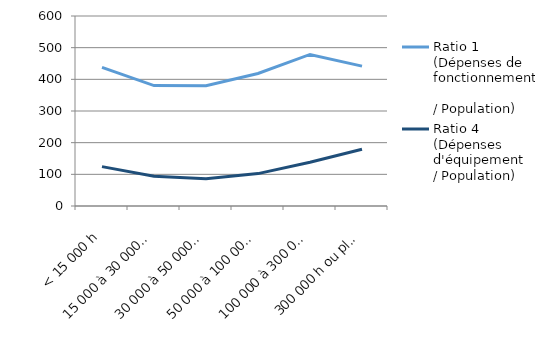
| Category | Ratio 1 
(Dépenses de fonctionnement 
/ Population) | Ratio 4 
(Dépenses d'équipement 
/ Population) |
|---|---|---|
| < 15 000 h | 437.864 | 124.358 |
| 15 000 à 30 000 h | 380.181 | 93.786 |
| 30 000 à 50 000 h | 379.52 | 85.946 |
| 50 000 à 100 000 h | 418.595 | 102.274 |
| 100 000 à 300 000 h | 478.568 | 138.416 |
| 300 000 h ou plus | 441.785 | 179.075 |